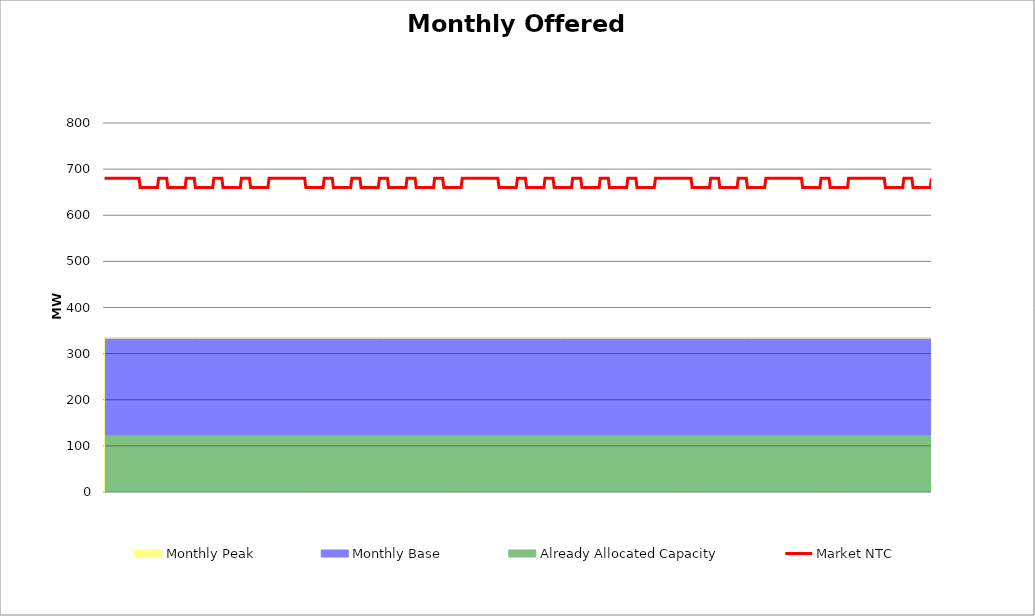
| Category | Market NTC |
|---|---|
| 0 | 680 |
| 1 | 680 |
| 2 | 680 |
| 3 | 680 |
| 4 | 680 |
| 5 | 680 |
| 6 | 680 |
| 7 | 680 |
| 8 | 680 |
| 9 | 680 |
| 10 | 680 |
| 11 | 680 |
| 12 | 680 |
| 13 | 680 |
| 14 | 680 |
| 15 | 680 |
| 16 | 680 |
| 17 | 680 |
| 18 | 680 |
| 19 | 680 |
| 20 | 680 |
| 21 | 680 |
| 22 | 680 |
| 23 | 680 |
| 24 | 680 |
| 25 | 680 |
| 26 | 680 |
| 27 | 680 |
| 28 | 680 |
| 29 | 680 |
| 30 | 680 |
| 31 | 660 |
| 32 | 660 |
| 33 | 660 |
| 34 | 660 |
| 35 | 660 |
| 36 | 660 |
| 37 | 660 |
| 38 | 660 |
| 39 | 660 |
| 40 | 660 |
| 41 | 660 |
| 42 | 660 |
| 43 | 660 |
| 44 | 660 |
| 45 | 660 |
| 46 | 660 |
| 47 | 680 |
| 48 | 680 |
| 49 | 680 |
| 50 | 680 |
| 51 | 680 |
| 52 | 680 |
| 53 | 680 |
| 54 | 680 |
| 55 | 660 |
| 56 | 660 |
| 57 | 660 |
| 58 | 660 |
| 59 | 660 |
| 60 | 660 |
| 61 | 660 |
| 62 | 660 |
| 63 | 660 |
| 64 | 660 |
| 65 | 660 |
| 66 | 660 |
| 67 | 660 |
| 68 | 660 |
| 69 | 660 |
| 70 | 660 |
| 71 | 680 |
| 72 | 680 |
| 73 | 680 |
| 74 | 680 |
| 75 | 680 |
| 76 | 680 |
| 77 | 680 |
| 78 | 680 |
| 79 | 660 |
| 80 | 660 |
| 81 | 660 |
| 82 | 660 |
| 83 | 660 |
| 84 | 660 |
| 85 | 660 |
| 86 | 660 |
| 87 | 660 |
| 88 | 660 |
| 89 | 660 |
| 90 | 660 |
| 91 | 660 |
| 92 | 660 |
| 93 | 660 |
| 94 | 660 |
| 95 | 680 |
| 96 | 680 |
| 97 | 680 |
| 98 | 680 |
| 99 | 680 |
| 100 | 680 |
| 101 | 680 |
| 102 | 680 |
| 103 | 660 |
| 104 | 660 |
| 105 | 660 |
| 106 | 660 |
| 107 | 660 |
| 108 | 660 |
| 109 | 660 |
| 110 | 660 |
| 111 | 660 |
| 112 | 660 |
| 113 | 660 |
| 114 | 660 |
| 115 | 660 |
| 116 | 660 |
| 117 | 660 |
| 118 | 660 |
| 119 | 680 |
| 120 | 680 |
| 121 | 680 |
| 122 | 680 |
| 123 | 680 |
| 124 | 680 |
| 125 | 680 |
| 126 | 680 |
| 127 | 660 |
| 128 | 660 |
| 129 | 660 |
| 130 | 660 |
| 131 | 660 |
| 132 | 660 |
| 133 | 660 |
| 134 | 660 |
| 135 | 660 |
| 136 | 660 |
| 137 | 660 |
| 138 | 660 |
| 139 | 660 |
| 140 | 660 |
| 141 | 660 |
| 142 | 660 |
| 143 | 680 |
| 144 | 680 |
| 145 | 680 |
| 146 | 680 |
| 147 | 680 |
| 148 | 680 |
| 149 | 680 |
| 150 | 680 |
| 151 | 680 |
| 152 | 680 |
| 153 | 680 |
| 154 | 680 |
| 155 | 680 |
| 156 | 680 |
| 157 | 680 |
| 158 | 680 |
| 159 | 680 |
| 160 | 680 |
| 161 | 680 |
| 162 | 680 |
| 163 | 680 |
| 164 | 680 |
| 165 | 680 |
| 166 | 680 |
| 167 | 680 |
| 168 | 680 |
| 169 | 680 |
| 170 | 680 |
| 171 | 680 |
| 172 | 680 |
| 173 | 680 |
| 174 | 680 |
| 175 | 660 |
| 176 | 660 |
| 177 | 660 |
| 178 | 660 |
| 179 | 660 |
| 180 | 660 |
| 181 | 660 |
| 182 | 660 |
| 183 | 660 |
| 184 | 660 |
| 185 | 660 |
| 186 | 660 |
| 187 | 660 |
| 188 | 660 |
| 189 | 660 |
| 190 | 660 |
| 191 | 680 |
| 192 | 680 |
| 193 | 680 |
| 194 | 680 |
| 195 | 680 |
| 196 | 680 |
| 197 | 680 |
| 198 | 680 |
| 199 | 660 |
| 200 | 660 |
| 201 | 660 |
| 202 | 660 |
| 203 | 660 |
| 204 | 660 |
| 205 | 660 |
| 206 | 660 |
| 207 | 660 |
| 208 | 660 |
| 209 | 660 |
| 210 | 660 |
| 211 | 660 |
| 212 | 660 |
| 213 | 660 |
| 214 | 660 |
| 215 | 680 |
| 216 | 680 |
| 217 | 680 |
| 218 | 680 |
| 219 | 680 |
| 220 | 680 |
| 221 | 680 |
| 222 | 680 |
| 223 | 660 |
| 224 | 660 |
| 225 | 660 |
| 226 | 660 |
| 227 | 660 |
| 228 | 660 |
| 229 | 660 |
| 230 | 660 |
| 231 | 660 |
| 232 | 660 |
| 233 | 660 |
| 234 | 660 |
| 235 | 660 |
| 236 | 660 |
| 237 | 660 |
| 238 | 660 |
| 239 | 680 |
| 240 | 680 |
| 241 | 680 |
| 242 | 680 |
| 243 | 680 |
| 244 | 680 |
| 245 | 680 |
| 246 | 680 |
| 247 | 660 |
| 248 | 660 |
| 249 | 660 |
| 250 | 660 |
| 251 | 660 |
| 252 | 660 |
| 253 | 660 |
| 254 | 660 |
| 255 | 660 |
| 256 | 660 |
| 257 | 660 |
| 258 | 660 |
| 259 | 660 |
| 260 | 660 |
| 261 | 660 |
| 262 | 660 |
| 263 | 680 |
| 264 | 680 |
| 265 | 680 |
| 266 | 680 |
| 267 | 680 |
| 268 | 680 |
| 269 | 680 |
| 270 | 680 |
| 271 | 660 |
| 272 | 660 |
| 273 | 660 |
| 274 | 660 |
| 275 | 660 |
| 276 | 660 |
| 277 | 660 |
| 278 | 660 |
| 279 | 660 |
| 280 | 660 |
| 281 | 660 |
| 282 | 660 |
| 283 | 660 |
| 284 | 660 |
| 285 | 660 |
| 286 | 660 |
| 287 | 680 |
| 288 | 680 |
| 289 | 680 |
| 290 | 680 |
| 291 | 680 |
| 292 | 680 |
| 293 | 680 |
| 294 | 680 |
| 295 | 660 |
| 296 | 660 |
| 297 | 660 |
| 298 | 660 |
| 299 | 660 |
| 300 | 660 |
| 301 | 660 |
| 302 | 660 |
| 303 | 660 |
| 304 | 660 |
| 305 | 660 |
| 306 | 660 |
| 307 | 660 |
| 308 | 660 |
| 309 | 660 |
| 310 | 660 |
| 311 | 680 |
| 312 | 680 |
| 313 | 680 |
| 314 | 680 |
| 315 | 680 |
| 316 | 680 |
| 317 | 680 |
| 318 | 680 |
| 319 | 680 |
| 320 | 680 |
| 321 | 680 |
| 322 | 680 |
| 323 | 680 |
| 324 | 680 |
| 325 | 680 |
| 326 | 680 |
| 327 | 680 |
| 328 | 680 |
| 329 | 680 |
| 330 | 680 |
| 331 | 680 |
| 332 | 680 |
| 333 | 680 |
| 334 | 680 |
| 335 | 680 |
| 336 | 680 |
| 337 | 680 |
| 338 | 680 |
| 339 | 680 |
| 340 | 680 |
| 341 | 680 |
| 342 | 680 |
| 343 | 660 |
| 344 | 660 |
| 345 | 660 |
| 346 | 660 |
| 347 | 660 |
| 348 | 660 |
| 349 | 660 |
| 350 | 660 |
| 351 | 660 |
| 352 | 660 |
| 353 | 660 |
| 354 | 660 |
| 355 | 660 |
| 356 | 660 |
| 357 | 660 |
| 358 | 660 |
| 359 | 680 |
| 360 | 680 |
| 361 | 680 |
| 362 | 680 |
| 363 | 680 |
| 364 | 680 |
| 365 | 680 |
| 366 | 680 |
| 367 | 660 |
| 368 | 660 |
| 369 | 660 |
| 370 | 660 |
| 371 | 660 |
| 372 | 660 |
| 373 | 660 |
| 374 | 660 |
| 375 | 660 |
| 376 | 660 |
| 377 | 660 |
| 378 | 660 |
| 379 | 660 |
| 380 | 660 |
| 381 | 660 |
| 382 | 660 |
| 383 | 680 |
| 384 | 680 |
| 385 | 680 |
| 386 | 680 |
| 387 | 680 |
| 388 | 680 |
| 389 | 680 |
| 390 | 680 |
| 391 | 660 |
| 392 | 660 |
| 393 | 660 |
| 394 | 660 |
| 395 | 660 |
| 396 | 660 |
| 397 | 660 |
| 398 | 660 |
| 399 | 660 |
| 400 | 660 |
| 401 | 660 |
| 402 | 660 |
| 403 | 660 |
| 404 | 660 |
| 405 | 660 |
| 406 | 660 |
| 407 | 680 |
| 408 | 680 |
| 409 | 680 |
| 410 | 680 |
| 411 | 680 |
| 412 | 680 |
| 413 | 680 |
| 414 | 680 |
| 415 | 660 |
| 416 | 660 |
| 417 | 660 |
| 418 | 660 |
| 419 | 660 |
| 420 | 660 |
| 421 | 660 |
| 422 | 660 |
| 423 | 660 |
| 424 | 660 |
| 425 | 660 |
| 426 | 660 |
| 427 | 660 |
| 428 | 660 |
| 429 | 660 |
| 430 | 660 |
| 431 | 680 |
| 432 | 680 |
| 433 | 680 |
| 434 | 680 |
| 435 | 680 |
| 436 | 680 |
| 437 | 680 |
| 438 | 680 |
| 439 | 660 |
| 440 | 660 |
| 441 | 660 |
| 442 | 660 |
| 443 | 660 |
| 444 | 660 |
| 445 | 660 |
| 446 | 660 |
| 447 | 660 |
| 448 | 660 |
| 449 | 660 |
| 450 | 660 |
| 451 | 660 |
| 452 | 660 |
| 453 | 660 |
| 454 | 660 |
| 455 | 680 |
| 456 | 680 |
| 457 | 680 |
| 458 | 680 |
| 459 | 680 |
| 460 | 680 |
| 461 | 680 |
| 462 | 680 |
| 463 | 660 |
| 464 | 660 |
| 465 | 660 |
| 466 | 660 |
| 467 | 660 |
| 468 | 660 |
| 469 | 660 |
| 470 | 660 |
| 471 | 660 |
| 472 | 660 |
| 473 | 660 |
| 474 | 660 |
| 475 | 660 |
| 476 | 660 |
| 477 | 660 |
| 478 | 660 |
| 479 | 680 |
| 480 | 680 |
| 481 | 680 |
| 482 | 680 |
| 483 | 680 |
| 484 | 680 |
| 485 | 680 |
| 486 | 680 |
| 487 | 680 |
| 488 | 680 |
| 489 | 680 |
| 490 | 680 |
| 491 | 680 |
| 492 | 680 |
| 493 | 680 |
| 494 | 680 |
| 495 | 680 |
| 496 | 680 |
| 497 | 680 |
| 498 | 680 |
| 499 | 680 |
| 500 | 680 |
| 501 | 680 |
| 502 | 680 |
| 503 | 680 |
| 504 | 680 |
| 505 | 680 |
| 506 | 680 |
| 507 | 680 |
| 508 | 680 |
| 509 | 680 |
| 510 | 680 |
| 511 | 660 |
| 512 | 660 |
| 513 | 660 |
| 514 | 660 |
| 515 | 660 |
| 516 | 660 |
| 517 | 660 |
| 518 | 660 |
| 519 | 660 |
| 520 | 660 |
| 521 | 660 |
| 522 | 660 |
| 523 | 660 |
| 524 | 660 |
| 525 | 660 |
| 526 | 660 |
| 527 | 680 |
| 528 | 680 |
| 529 | 680 |
| 530 | 680 |
| 531 | 680 |
| 532 | 680 |
| 533 | 680 |
| 534 | 680 |
| 535 | 660 |
| 536 | 660 |
| 537 | 660 |
| 538 | 660 |
| 539 | 660 |
| 540 | 660 |
| 541 | 660 |
| 542 | 660 |
| 543 | 660 |
| 544 | 660 |
| 545 | 660 |
| 546 | 660 |
| 547 | 660 |
| 548 | 660 |
| 549 | 660 |
| 550 | 660 |
| 551 | 680 |
| 552 | 680 |
| 553 | 680 |
| 554 | 680 |
| 555 | 680 |
| 556 | 680 |
| 557 | 680 |
| 558 | 680 |
| 559 | 660 |
| 560 | 660 |
| 561 | 660 |
| 562 | 660 |
| 563 | 660 |
| 564 | 660 |
| 565 | 660 |
| 566 | 660 |
| 567 | 660 |
| 568 | 660 |
| 569 | 660 |
| 570 | 660 |
| 571 | 660 |
| 572 | 660 |
| 573 | 660 |
| 574 | 660 |
| 575 | 680 |
| 576 | 680 |
| 577 | 680 |
| 578 | 680 |
| 579 | 680 |
| 580 | 680 |
| 581 | 680 |
| 582 | 680 |
| 583 | 680 |
| 584 | 680 |
| 585 | 680 |
| 586 | 680 |
| 587 | 680 |
| 588 | 680 |
| 589 | 680 |
| 590 | 680 |
| 591 | 680 |
| 592 | 680 |
| 593 | 680 |
| 594 | 680 |
| 595 | 680 |
| 596 | 680 |
| 597 | 680 |
| 598 | 680 |
| 599 | 680 |
| 600 | 680 |
| 601 | 680 |
| 602 | 680 |
| 603 | 680 |
| 604 | 680 |
| 605 | 680 |
| 606 | 680 |
| 607 | 660 |
| 608 | 660 |
| 609 | 660 |
| 610 | 660 |
| 611 | 660 |
| 612 | 660 |
| 613 | 660 |
| 614 | 660 |
| 615 | 660 |
| 616 | 660 |
| 617 | 660 |
| 618 | 660 |
| 619 | 660 |
| 620 | 660 |
| 621 | 660 |
| 622 | 660 |
| 623 | 680 |
| 624 | 680 |
| 625 | 680 |
| 626 | 680 |
| 627 | 680 |
| 628 | 680 |
| 629 | 680 |
| 630 | 680 |
| 631 | 660 |
| 632 | 660 |
| 633 | 660 |
| 634 | 660 |
| 635 | 660 |
| 636 | 660 |
| 637 | 660 |
| 638 | 660 |
| 639 | 660 |
| 640 | 660 |
| 641 | 660 |
| 642 | 660 |
| 643 | 660 |
| 644 | 660 |
| 645 | 660 |
| 646 | 660 |
| 647 | 680 |
| 648 | 680 |
| 649 | 680 |
| 650 | 680 |
| 651 | 680 |
| 652 | 680 |
| 653 | 680 |
| 654 | 680 |
| 655 | 680 |
| 656 | 680 |
| 657 | 680 |
| 658 | 680 |
| 659 | 680 |
| 660 | 680 |
| 661 | 680 |
| 662 | 680 |
| 663 | 680 |
| 664 | 680 |
| 665 | 680 |
| 666 | 680 |
| 667 | 680 |
| 668 | 680 |
| 669 | 680 |
| 670 | 680 |
| 671 | 680 |
| 672 | 680 |
| 673 | 680 |
| 674 | 680 |
| 675 | 680 |
| 676 | 680 |
| 677 | 680 |
| 678 | 680 |
| 679 | 660 |
| 680 | 660 |
| 681 | 660 |
| 682 | 660 |
| 683 | 660 |
| 684 | 660 |
| 685 | 660 |
| 686 | 660 |
| 687 | 660 |
| 688 | 660 |
| 689 | 660 |
| 690 | 660 |
| 691 | 660 |
| 692 | 660 |
| 693 | 660 |
| 694 | 660 |
| 695 | 680 |
| 696 | 680 |
| 697 | 680 |
| 698 | 680 |
| 699 | 680 |
| 700 | 680 |
| 701 | 680 |
| 702 | 680 |
| 703 | 660 |
| 704 | 660 |
| 705 | 660 |
| 706 | 660 |
| 707 | 660 |
| 708 | 660 |
| 709 | 660 |
| 710 | 660 |
| 711 | 660 |
| 712 | 660 |
| 713 | 660 |
| 714 | 660 |
| 715 | 660 |
| 716 | 660 |
| 717 | 660 |
| 718 | 660 |
| 719 | 680 |